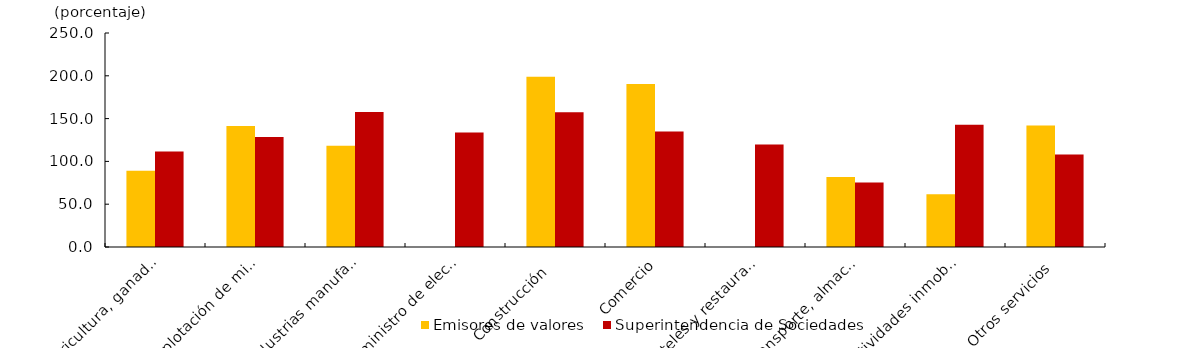
| Category | Emisores de valores | Superintendencia de Sociedades |
|---|---|---|
| Agricultura, ganaderia, caza, silvicutura y pesca | 89.184 | 111.582 |
| Explotación de minas y canteras | 141.343 | 128.505 |
| Industrias manufactureras | 118.253 | 157.803 |
| Suministro de electricidad, gas y agua | 0 | 133.717 |
| Construcción  | 198.93 | 157.327 |
| Comercio | 190.275 | 134.976 |
| Hoteles y restaurantes | 0 | 119.767 |
| Transporte, almacenamiento y comunicaciones | 81.759 | 75.475 |
| Actividades inmobiliarias, de alquiler y empresariales | 61.604 | 142.846 |
| Otros servicios | 142.077 | 108.189 |